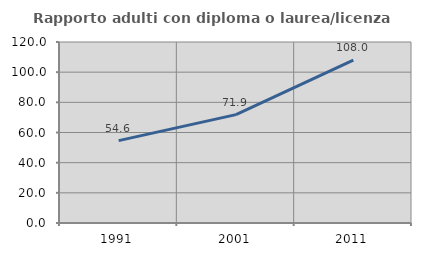
| Category | Rapporto adulti con diploma o laurea/licenza media  |
|---|---|
| 1991.0 | 54.598 |
| 2001.0 | 71.864 |
| 2011.0 | 108.04 |